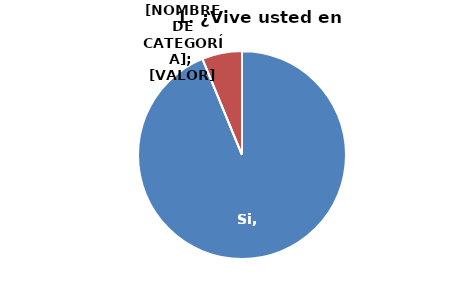
| Category | Series 0 |
|---|---|
| Si | 0.938 |
| No | 0.062 |